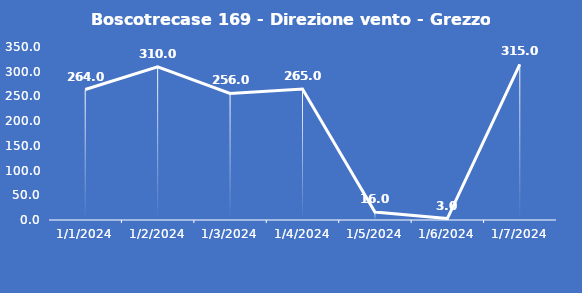
| Category | Boscotrecase 169 - Direzione vento - Grezzo (°N) |
|---|---|
| 1/1/24 | 264 |
| 1/2/24 | 310 |
| 1/3/24 | 256 |
| 1/4/24 | 265 |
| 1/5/24 | 16 |
| 1/6/24 | 3 |
| 1/7/24 | 315 |